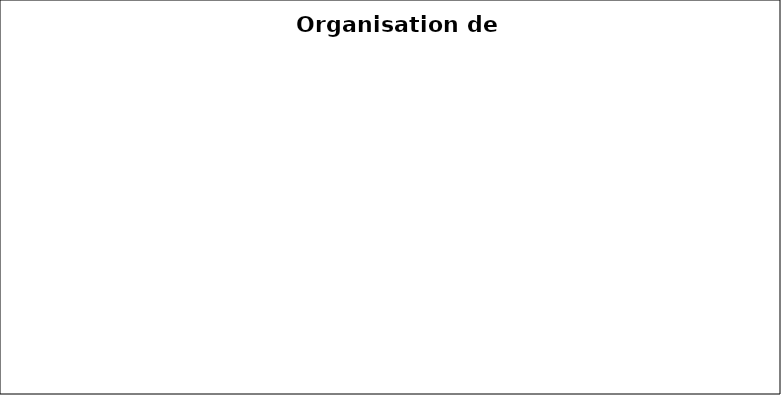
| Category | Series 0 | Series 1 |
|---|---|---|
| Assolement | 0 | 8 |
| Dimension des parcelles | 0 | 6 |
| Gestion des matières organiques | 0 | 5 |
| Zones de régulation écologique | 0 | 12 |
| Contribution aux enjeux environnementaux du territoire | 0 | 4 |
| Valorisation de l'espace | 0 | 5 |
| Gestion des surfaces fourragères | 0 | 3 |